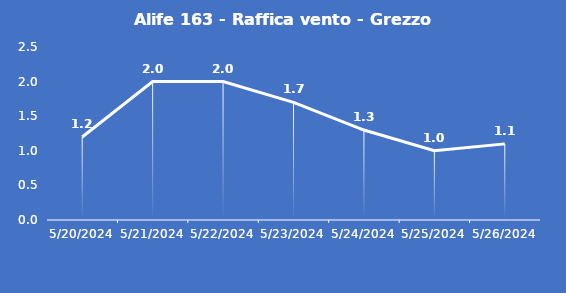
| Category | Alife 163 - Raffica vento - Grezzo (m/s) |
|---|---|
| 5/20/24 | 1.2 |
| 5/21/24 | 2 |
| 5/22/24 | 2 |
| 5/23/24 | 1.7 |
| 5/24/24 | 1.3 |
| 5/25/24 | 1 |
| 5/26/24 | 1.1 |